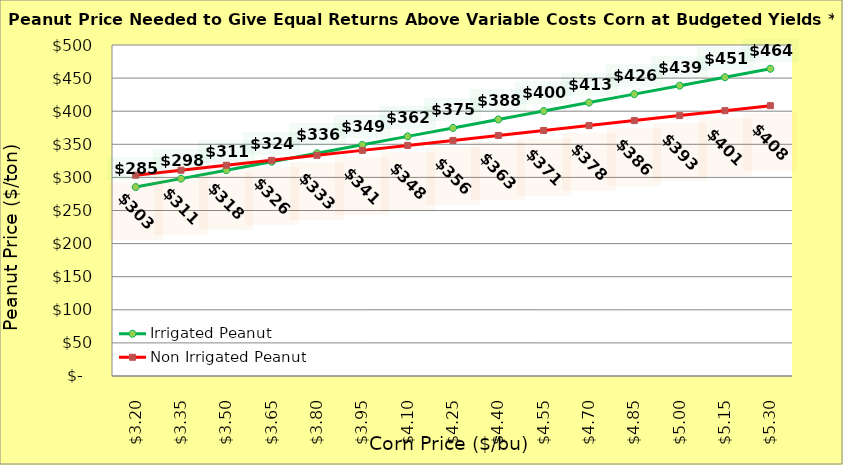
| Category | Irrigated Peanut | Non Irrigated Peanut |
|---|---|---|
| 3.2 | 285.382 | 303.332 |
| 3.35 | 298.148 | 310.832 |
| 3.5 | 310.914 | 318.332 |
| 3.65 | 323.68 | 325.832 |
| 3.8 | 336.446 | 333.332 |
| 3.9499999999999997 | 349.212 | 340.832 |
| 4.1 | 361.978 | 348.332 |
| 4.25 | 374.744 | 355.832 |
| 4.4 | 387.509 | 363.332 |
| 4.550000000000001 | 400.275 | 370.832 |
| 4.700000000000001 | 413.041 | 378.332 |
| 4.850000000000001 | 425.807 | 385.832 |
| 5.000000000000002 | 438.573 | 393.332 |
| 5.150000000000002 | 451.339 | 400.832 |
| 5.3000000000000025 | 464.105 | 408.332 |